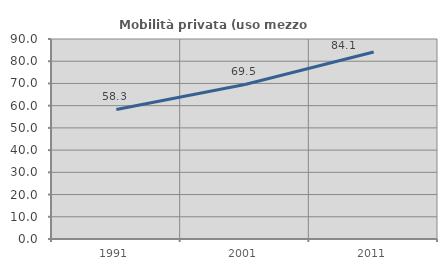
| Category | Mobilità privata (uso mezzo privato) |
|---|---|
| 1991.0 | 58.294 |
| 2001.0 | 69.525 |
| 2011.0 | 84.138 |